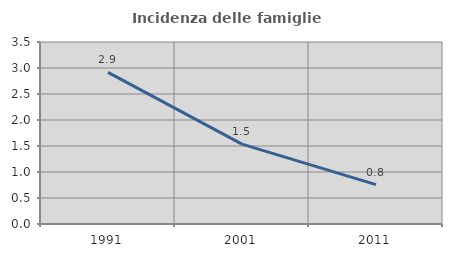
| Category | Incidenza delle famiglie numerose |
|---|---|
| 1991.0 | 2.915 |
| 2001.0 | 1.535 |
| 2011.0 | 0.758 |